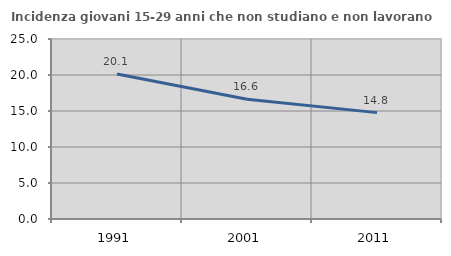
| Category | Incidenza giovani 15-29 anni che non studiano e non lavorano  |
|---|---|
| 1991.0 | 20.128 |
| 2001.0 | 16.624 |
| 2011.0 | 14.774 |